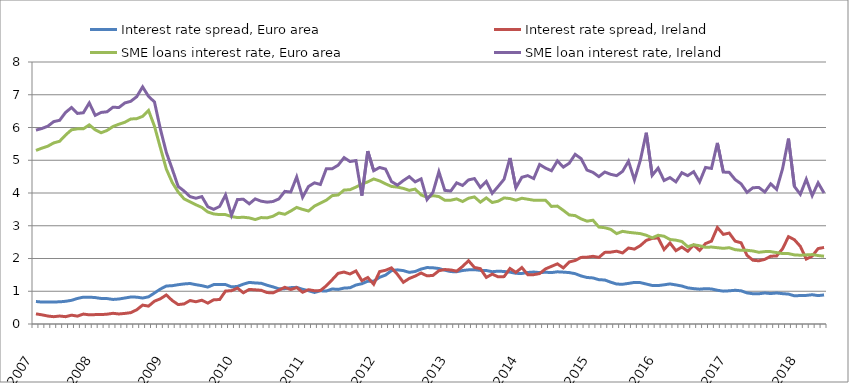
| Category | Interest rate spread, Euro area | Interest rate spread, Ireland | SME loans interest rate, Euro area | SME loan interest rate, Ireland |
|---|---|---|---|---|
| 2007.0 | 0.687 | 0.31 | 5.3 | 5.92 |
| nan | 0.67 | 0.28 | 5.37 | 5.97 |
| nan | 0.673 | 0.243 | 5.43 | 6.04 |
| nan | 0.673 | 0.223 | 5.53 | 6.18 |
| nan | 0.677 | 0.243 | 5.58 | 6.22 |
| nan | 0.693 | 0.223 | 5.77 | 6.46 |
| nan | 0.723 | 0.27 | 5.93 | 6.61 |
| nan | 0.78 | 0.24 | 5.96 | 6.43 |
| nan | 0.82 | 0.303 | 5.96 | 6.45 |
| nan | 0.82 | 0.28 | 6.08 | 6.75 |
| 2008.0 | 0.807 | 0.287 | 5.93 | 6.37 |
| nan | 0.78 | 0.287 | 5.84 | 6.46 |
| nan | 0.777 | 0.3 | 5.91 | 6.48 |
| nan | 0.75 | 0.327 | 6.03 | 6.62 |
| nan | 0.763 | 0.307 | 6.1 | 6.61 |
| nan | 0.793 | 0.323 | 6.16 | 6.75 |
| nan | 0.823 | 0.347 | 6.26 | 6.8 |
| nan | 0.82 | 0.433 | 6.27 | 6.94 |
| nan | 0.793 | 0.577 | 6.34 | 7.24 |
| nan | 0.83 | 0.547 | 6.52 | 6.95 |
| nan | 0.947 | 0.697 | 6.04 | 6.78 |
| nan | 1.067 | 0.77 | 5.38 | 5.95 |
| 2009.0 | 1.16 | 0.887 | 4.73 | 5.24 |
| nan | 1.17 | 0.717 | 4.32 | 4.73 |
| nan | 1.2 | 0.593 | 4.03 | 4.2 |
| nan | 1.223 | 0.613 | 3.82 | 4.06 |
| nan | 1.237 | 0.717 | 3.73 | 3.89 |
| nan | 1.2 | 0.68 | 3.64 | 3.84 |
| nan | 1.17 | 0.727 | 3.56 | 3.89 |
| nan | 1.127 | 0.637 | 3.42 | 3.58 |
| nan | 1.203 | 0.74 | 3.36 | 3.5 |
| nan | 1.207 | 0.747 | 3.34 | 3.59 |
| nan | 1.203 | 1.007 | 3.34 | 3.94 |
| nan | 1.133 | 1.017 | 3.28 | 3.32 |
| 2010.0 | 1.147 | 1.097 | 3.25 | 3.8 |
| nan | 1.217 | 0.953 | 3.26 | 3.81 |
| nan | 1.27 | 1.057 | 3.24 | 3.67 |
| nan | 1.253 | 1.043 | 3.19 | 3.82 |
| nan | 1.243 | 1.03 | 3.25 | 3.75 |
| nan | 1.183 | 0.96 | 3.24 | 3.72 |
| nan | 1.133 | 0.95 | 3.29 | 3.74 |
| nan | 1.073 | 1.033 | 3.39 | 3.82 |
| nan | 1.08 | 1.12 | 3.35 | 4.05 |
| nan | 1.11 | 1.053 | 3.45 | 4.03 |
| nan | 1.12 | 1.113 | 3.56 | 4.49 |
| nan | 1.06 | 0.97 | 3.5 | 3.87 |
| 2011.0 | 1.017 | 1.047 | 3.45 | 4.2 |
| nan | 0.963 | 1.017 | 3.6 | 4.31 |
| nan | 1.013 | 1.02 | 3.69 | 4.26 |
| nan | 1.007 | 1.167 | 3.78 | 4.74 |
| nan | 1.07 | 1.353 | 3.92 | 4.74 |
| nan | 1.057 | 1.547 | 3.94 | 4.85 |
| nan | 1.097 | 1.587 | 4.09 | 5.08 |
| nan | 1.107 | 1.527 | 4.1 | 4.96 |
| nan | 1.19 | 1.62 | 4.18 | 4.99 |
| nan | 1.23 | 1.323 | 4.27 | 3.92 |
| nan | 1.307 | 1.42 | 4.34 | 5.28 |
| nan | 1.307 | 1.213 | 4.43 | 4.68 |
| 2012.0 | 1.427 | 1.6 | 4.37 | 4.78 |
| nan | 1.493 | 1.64 | 4.28 | 4.73 |
| nan | 1.63 | 1.713 | 4.2 | 4.35 |
| nan | 1.653 | 1.517 | 4.18 | 4.24 |
| nan | 1.63 | 1.273 | 4.14 | 4.38 |
| nan | 1.577 | 1.39 | 4.08 | 4.5 |
| nan | 1.603 | 1.463 | 4.12 | 4.34 |
| nan | 1.677 | 1.557 | 3.94 | 4.43 |
| nan | 1.723 | 1.47 | 3.87 | 3.8 |
| nan | 1.717 | 1.483 | 3.92 | 4.02 |
| nan | 1.693 | 1.627 | 3.89 | 4.65 |
| nan | 1.643 | 1.663 | 3.78 | 4.08 |
| 2013.0 | 1.6 | 1.65 | 3.78 | 4.06 |
| nan | 1.597 | 1.613 | 3.82 | 4.31 |
| nan | 1.633 | 1.757 | 3.74 | 4.23 |
| nan | 1.653 | 1.933 | 3.84 | 4.4 |
| nan | 1.66 | 1.727 | 3.88 | 4.44 |
| nan | 1.637 | 1.69 | 3.72 | 4.17 |
| nan | 1.633 | 1.423 | 3.85 | 4.35 |
| nan | 1.597 | 1.523 | 3.71 | 3.99 |
| nan | 1.613 | 1.44 | 3.75 | 4.2 |
| nan | 1.603 | 1.447 | 3.85 | 4.42 |
| nan | 1.583 | 1.697 | 3.83 | 5.07 |
| nan | 1.547 | 1.577 | 3.78 | 4.16 |
| 2014.0 | 1.543 | 1.723 | 3.84 | 4.48 |
| nan | 1.573 | 1.507 | 3.81 | 4.53 |
| nan | 1.587 | 1.507 | 3.78 | 4.44 |
| nan | 1.57 | 1.54 | 3.78 | 4.87 |
| nan | 1.58 | 1.683 | 3.78 | 4.76 |
| nan | 1.57 | 1.76 | 3.59 | 4.68 |
| nan | 1.593 | 1.837 | 3.6 | 4.98 |
| nan | 1.583 | 1.713 | 3.47 | 4.79 |
| nan | 1.57 | 1.893 | 3.33 | 4.91 |
| nan | 1.537 | 1.94 | 3.31 | 5.18 |
| nan | 1.467 | 2.033 | 3.21 | 5.05 |
| nan | 1.42 | 2.04 | 3.14 | 4.7 |
| 2015.0 | 1.407 | 2.067 | 3.17 | 4.63 |
| nan | 1.353 | 2.033 | 2.96 | 4.5 |
| nan | 1.343 | 2.187 | 2.94 | 4.64 |
| nan | 1.277 | 2.193 | 2.89 | 4.57 |
| nan | 1.22 | 2.223 | 2.76 | 4.53 |
| nan | 1.213 | 2.17 | 2.83 | 4.66 |
| nan | 1.24 | 2.32 | 2.8 | 4.97 |
| nan | 1.27 | 2.287 | 2.78 | 4.4 |
| nan | 1.263 | 2.393 | 2.76 | 5 |
| nan | 1.22 | 2.553 | 2.71 | 5.84 |
| nan | 1.177 | 2.613 | 2.63 | 4.54 |
| 2016.0 | 1.173 | 2.63 | 2.71 | 4.76 |
| nan | 1.197 | 2.273 | 2.68 | 4.38 |
| nan | 1.223 | 2.473 | 2.58 | 4.47 |
| nan | 1.193 | 2.24 | 2.56 | 4.34 |
| nan | 1.16 | 2.35 | 2.52 | 4.62 |
| nan | 1.103 | 2.223 | 2.36 | 4.53 |
| nan | 1.08 | 2.41 | 2.42 | 4.65 |
| nan | 1.063 | 2.247 | 2.39 | 4.34 |
| nan | 1.08 | 2.457 | 2.34 | 4.78 |
| nan | 1.07 | 2.53 | 2.35 | 4.75 |
| nan | 1.03 | 2.947 | 2.33 | 5.53 |
| nan | 1.003 | 2.737 | 2.31 | 4.64 |
| 2017.0 | 1.013 | 2.777 | 2.33 | 4.63 |
| nan | 1.03 | 2.53 | 2.27 | 4.41 |
| nan | 1.013 | 2.48 | 2.25 | 4.28 |
| nan | 0.95 | 2.097 | 2.25 | 4.02 |
| nan | 0.923 | 1.947 | 2.23 | 4.16 |
| nan | 0.923 | 1.93 | 2.19 | 4.17 |
| nan | 0.947 | 1.973 | 2.21 | 4.03 |
| nan | 0.93 | 2.07 | 2.21 | 4.28 |
| nan | 0.947 | 2.077 | 2.18 | 4.11 |
| nan | 0.927 | 2.297 | 2.15 | 4.74 |
| nan | 0.913 | 2.667 | 2.15 | 5.66 |
| nan | 0.86 | 2.573 | 2.11 | 4.2 |
| 2018.0 | 0.87 | 2.37 | 2.1 | 3.96 |
| nan | 0.873 | 1.983 | 2.11 | 4.42 |
| nan | 0.893 | 2.073 | 2.12 | 3.92 |
| nan | 0.867 | 2.303 | 2.09 | 4.31 |
| nan | 0.887 | 2.337 | 2.07 | 4 |